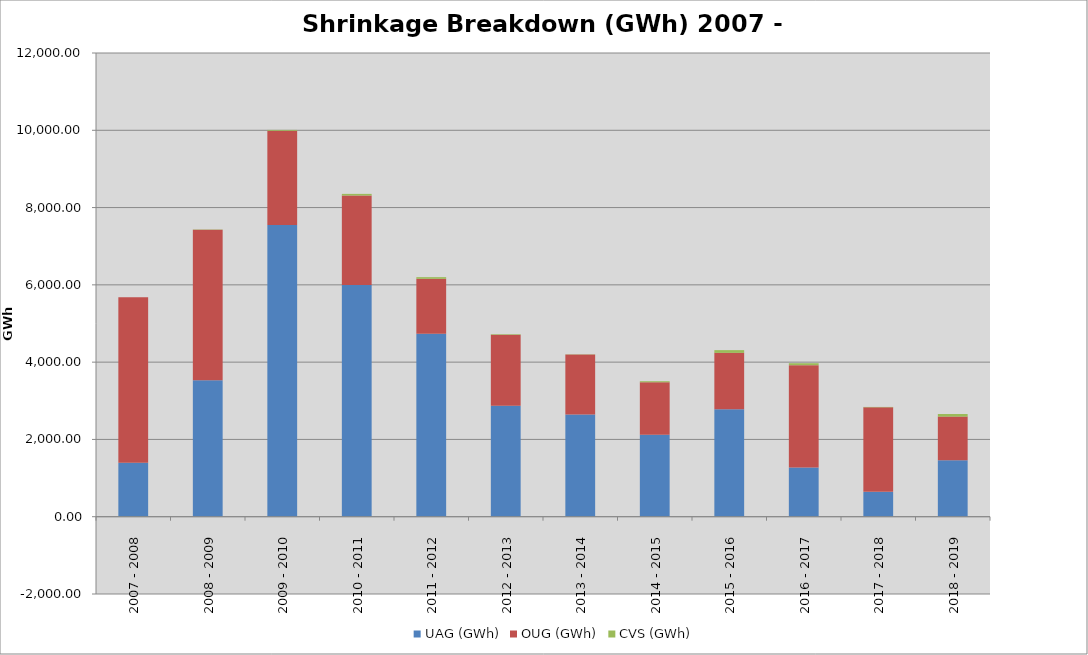
| Category | UAG (GWh) | OUG (GWh) | CVS (GWh) |
|---|---|---|---|
| 2007 - 2008 | 1398.285 | 4278.392 | -4.579 |
| 2008 - 2009 | 3530.957 | 3893.886 | 7.733 |
| 2009 - 2010 | 7550.984 | 2436.968 | 21.544 |
| 2010 - 2011 | 5995.931 | 2316.569 | 41.687 |
| 2011 - 2012 | 4736.63 | 1420.093 | 42.855 |
| 2012 - 2013 | 2873.58 | 1834.959 | 15.137 |
| 2013 - 2014 | 2648.01 | 1548.032 | 5.803 |
| 2014 - 2015 | 2121.263 | 1357.73 | 27.039 |
| 2015 - 2016 | 2782.234 | 1457.817 | 70.93 |
| 2016 - 2017 | 1271.669 | 2649.964 | 50.614 |
| 2017 - 2018 | 643.285 | 2187.924 | 9.718 |
| 2018 - 2019 | 1464.048 | 1126.76 | 67.053 |